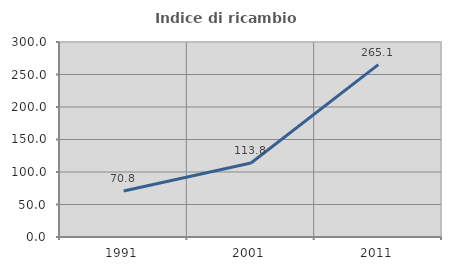
| Category | Indice di ricambio occupazionale  |
|---|---|
| 1991.0 | 70.787 |
| 2001.0 | 113.793 |
| 2011.0 | 265.138 |